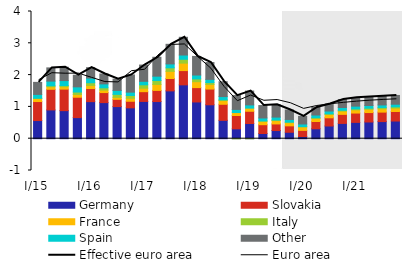
| Category | Germany | Slovakia | France | Italy | Spain | Other |
|---|---|---|---|---|---|---|
| I/15 | 0.571 | 0.598 | 0.096 | 0.008 | 0.12 | 0.378 |
| II | 0.905 | 0.65 | 0.079 | 0.032 | 0.146 | 0.416 |
| III | 0.882 | 0.677 | 0.075 | 0.037 | 0.156 | 0.42 |
| IV | 0.663 | 0.641 | 0.085 | 0.078 | 0.163 | 0.366 |
| I/16 | 1.166 | 0.411 | 0.098 | 0.085 | 0.147 | 0.327 |
| II | 1.135 | 0.316 | 0.078 | 0.072 | 0.123 | 0.312 |
| III | 1.01 | 0.228 | 0.063 | 0.094 | 0.125 | 0.356 |
| IV | 0.971 | 0.206 | 0.095 | 0.087 | 0.105 | 0.541 |
| I/17 | 1.172 | 0.307 | 0.11 | 0.106 | 0.11 | 0.511 |
| II | 1.168 | 0.351 | 0.188 | 0.122 | 0.138 | 0.594 |
| III | 1.504 | 0.39 | 0.224 | 0.111 | 0.123 | 0.616 |
| IV | 1.693 | 0.449 | 0.234 | 0.121 | 0.134 | 0.557 |
| I/18 | 1.156 | 0.451 | 0.186 | 0.088 | 0.121 | 0.585 |
| II | 1.066 | 0.494 | 0.146 | 0.058 | 0.102 | 0.529 |
| III | 0.577 | 0.505 | 0.117 | 0.024 | 0.102 | 0.468 |
| IV | 0.311 | 0.419 | 0.093 | -0.003 | 0.098 | 0.436 |
| I/19 | 0.477 | 0.385 | 0.098 | -0.001 | 0.102 | 0.436 |
| II | 0.164 | 0.277 | 0.111 | 0.007 | 0.094 | 0.39 |
| III | 0.257 | 0.208 | 0.106 | 0.019 | 0.09 | 0.39 |
| IV | 0.203 | 0.202 | 0.099 | 0.017 | 0.084 | 0.298 |
| I/20 | 0.07 | 0.193 | 0.105 | 0.015 | 0.081 | 0.239 |
| II | 0.313 | 0.227 | 0.101 | 0.017 | 0.086 | 0.239 |
| III | 0.4 | 0.258 | 0.105 | 0.021 | 0.088 | 0.221 |
| IV | 0.481 | 0.285 | 0.103 | 0.026 | 0.088 | 0.249 |
| I/21 | 0.513 | 0.293 | 0.101 | 0.03 | 0.087 | 0.26 |
| II | 0.526 | 0.296 | 0.103 | 0.034 | 0.085 | 0.265 |
| III | 0.539 | 0.298 | 0.105 | 0.038 | 0.084 | 0.27 |
| IV | 0.556 | 0.3 | 0.107 | 0.04 | 0.083 | 0.275 |